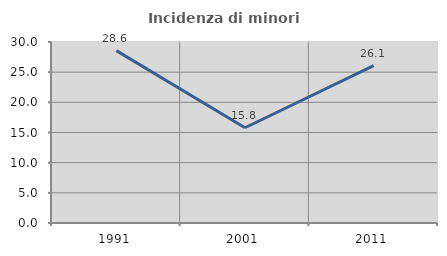
| Category | Incidenza di minori stranieri |
|---|---|
| 1991.0 | 28.571 |
| 2001.0 | 15.789 |
| 2011.0 | 26.087 |